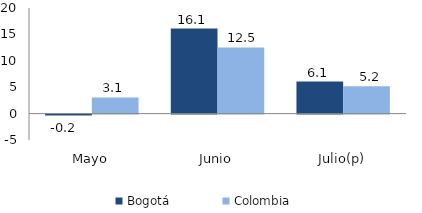
| Category | Bogotá | Colombia |
|---|---|---|
| Mayo | -0.15 | 3.059 |
| Junio | 16.097 | 12.531 |
| Julio(p) | 6.06 | 5.176 |